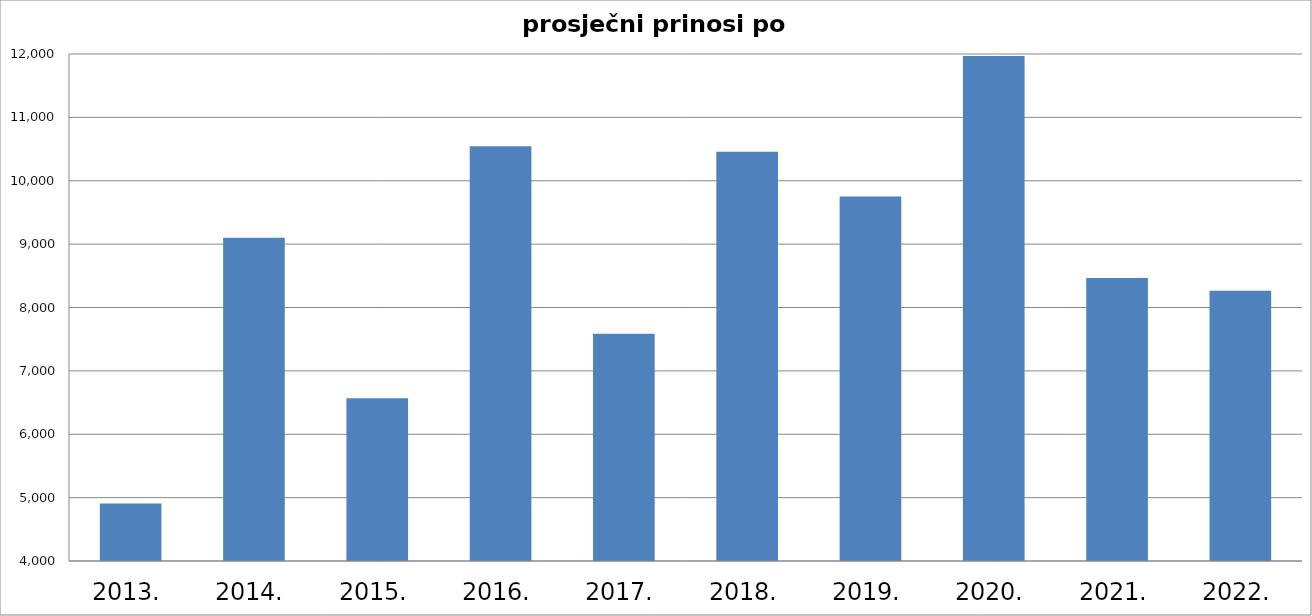
| Category | Series 0 |
|---|---|
| 2013. | 4907 |
| 2014. | 9101 |
| 2015. | 6568 |
| 2016. | 10544 |
| 2017. | 7587 |
| 2018. | 10456 |
| 2019. | 9752 |
| 2020. | 11969 |
| 2021. | 8465 |
| 2022. | 8265 |